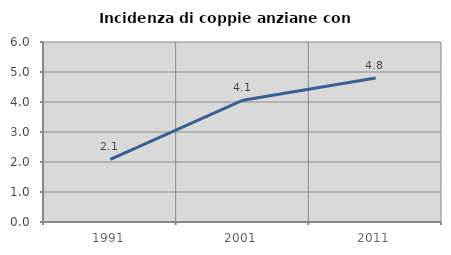
| Category | Incidenza di coppie anziane con figli |
|---|---|
| 1991.0 | 2.091 |
| 2001.0 | 4.059 |
| 2011.0 | 4.799 |